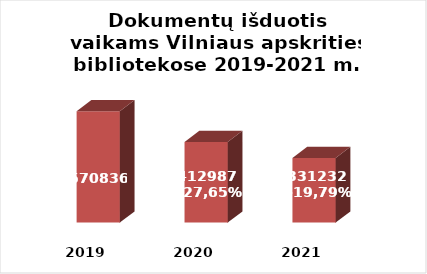
| Category | Series 0 |
|---|---|
| 2019.0 | 570836 |
| 2020.0 | 412987 |
| 2021.0 | 331232 |